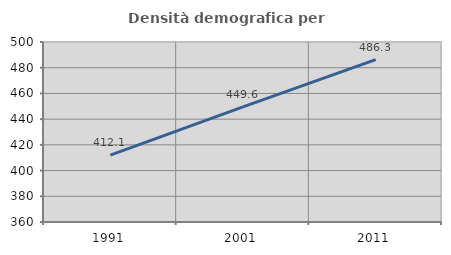
| Category | Densità demografica |
|---|---|
| 1991.0 | 412.061 |
| 2001.0 | 449.595 |
| 2011.0 | 486.254 |